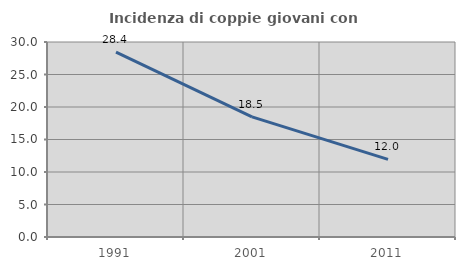
| Category | Incidenza di coppie giovani con figli |
|---|---|
| 1991.0 | 28.433 |
| 2001.0 | 18.476 |
| 2011.0 | 11.951 |